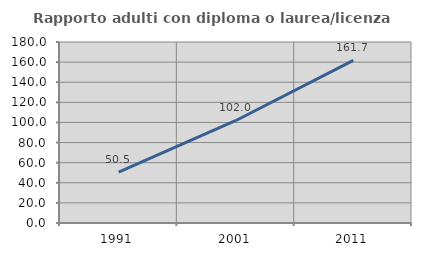
| Category | Rapporto adulti con diploma o laurea/licenza media  |
|---|---|
| 1991.0 | 50.519 |
| 2001.0 | 101.961 |
| 2011.0 | 161.672 |